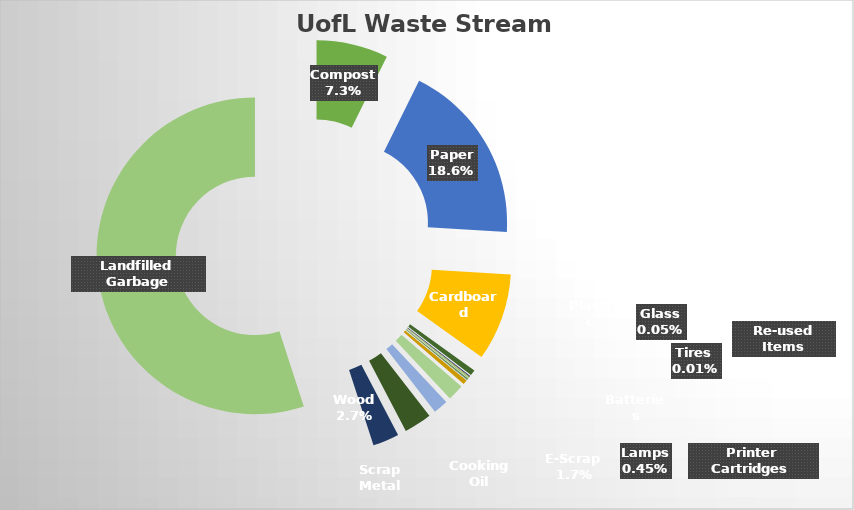
| Category | Series 0 |
|---|---|
| Compost | 389040 |
| Paper | 991340 |
| Cardboard | 475160 |
| Plastic | 30920 |
| Aluminum | 5160 |
| Glass | 2580 |
| Re-used Items | 5539 |
| Tires  | 480 |
| Waste Petroleum Products | 0 |
| Batteries | 6905 |
| Printer Cartridges  | 1167.5 |
| Lamps | 24150 |
| E-Scrap | 88476 |
| Cooking Oil | 79800 |
| Concrete | 0 |
| Scrap Metal | 150240 |
| Wood | 142680 |
| Coal Ash | 0 |
| Landfilled Garbage | 2924720 |